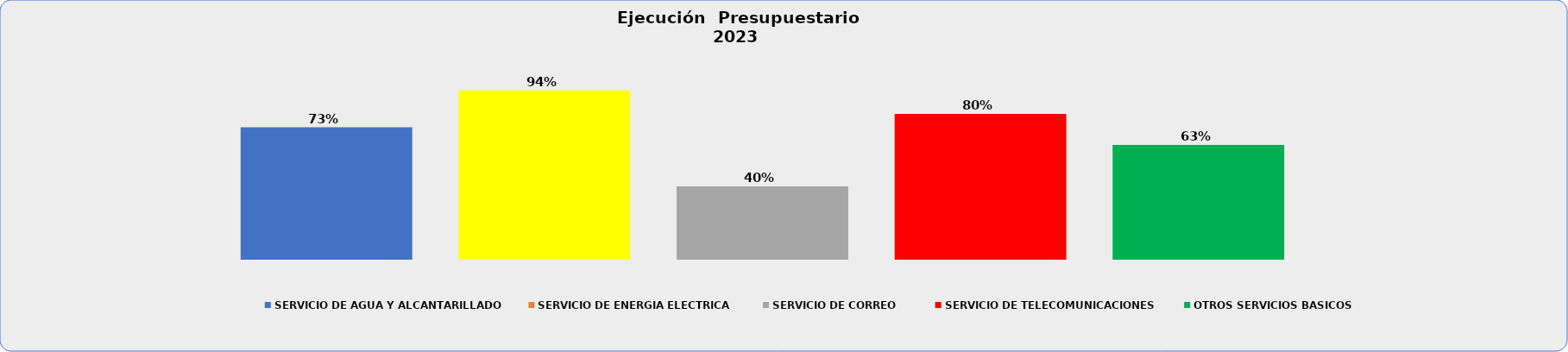
| Category | SERVICIO DE AGUA Y ALCANTARILLADO | SERVICIO DE ENERGIA ELECTRICA | SERVICIO DE CORREO | SERVICIO DE TELECOMUNICACIONES | OTROS SERVICIOS BASICOS |
|---|---|---|---|---|---|
| 0 | 0.73 | 0.935 | 0.405 | 0.804 | 0.633 |